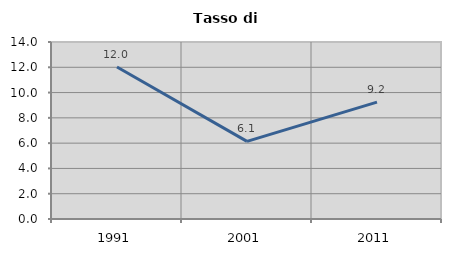
| Category | Tasso di disoccupazione   |
|---|---|
| 1991.0 | 12.022 |
| 2001.0 | 6.138 |
| 2011.0 | 9.24 |